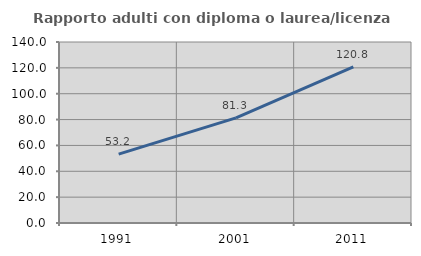
| Category | Rapporto adulti con diploma o laurea/licenza media  |
|---|---|
| 1991.0 | 53.242 |
| 2001.0 | 81.322 |
| 2011.0 | 120.758 |